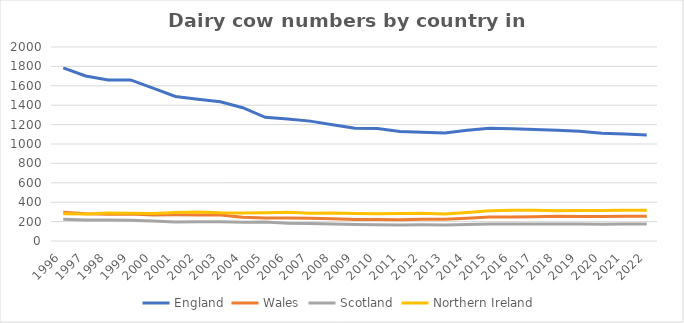
| Category | England | Wales | Scotland | Northern Ireland  |
|---|---|---|---|---|
| 1996.0 | 1784.745 | 296.743 | 225 | 280.829 |
| 1997.0 | 1701.668 | 280.758 | 217 | 279.191 |
| 1998.0 | 1659.649 | 276.336 | 215.58 | 287.661 |
| 1999.0 | 1660.628 | 278.838 | 214.49 | 286.35 |
| 2000.0 | 1575.484 | 268.591 | 207.349 | 284.385 |
| 2001.0 | 1490.227 | 269.978 | 195.953 | 295.004 |
| 2002.0 | 1462.131 | 267.737 | 199.399 | 297.935 |
| 2003.0 | 1434.696 | 268.14 | 197.972 | 290.145 |
| 2004.0 | 1374.477 | 244.776 | 194.544 | 288.296 |
| 2005.0 | 1275.576 | 238.386 | 196.71 | 290.53 |
| 2006.0 | 1258.73 | 236.822 | 182.681 | 295.951 |
| 2007.0 | 1235.908 | 234.081 | 181.341 | 286.073 |
| 2008.0 | 1198.824 | 228.614 | 174.901 | 289.247 |
| 2009.0 | 1163.364 | 221.44 | 168.832 | 284.698 |
| 2010.0 | 1159.726 | 221.34 | 167.623 | 281.043 |
| 2011.0 | 1128.97 | 220.322 | 164.018 | 282.487 |
| 2012.0 | 1120.536 | 223.557 | 166.781 | 285.369 |
| 2013.0 | 1113.494 | 223.208 | 165.672 | 279.481 |
| 2014.0 | 1142.822 | 234.305 | 169.716 | 294.192 |
| 2015.0 | 1161.798 | 246.331 | 175.734 | 311.52 |
| 2016.0 | 1156.137 | 248.65 | 175.194 | 317.146 |
| 2017.0 | 1150.008 | 251.176 | 174.442 | 315.8 |
| 2018.0 | 1142.874 | 254.255 | 174.731 | 310.7 |
| 2019.0 | 1130.504 | 251.592 | 175.8 | 313.5 |
| 2020.0 | 1112 | 252 | 173 | 314 |
| 2021.0 | 1102 | 255 | 174 | 318 |
| 2022.0 | 1093.845 | 255.9 | 175.304 | 316.775 |